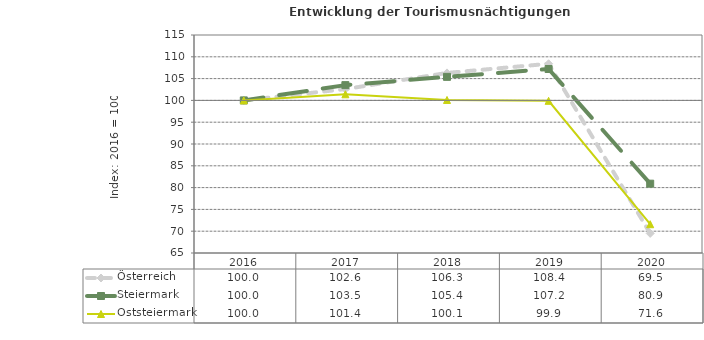
| Category | Österreich | Steiermark | Oststeiermark |
|---|---|---|---|
| 2020.0 | 69.5 | 80.9 | 71.6 |
| 2019.0 | 108.4 | 107.2 | 99.9 |
| 2018.0 | 106.3 | 105.4 | 100.1 |
| 2017.0 | 102.6 | 103.5 | 101.4 |
| 2016.0 | 100 | 100 | 100 |